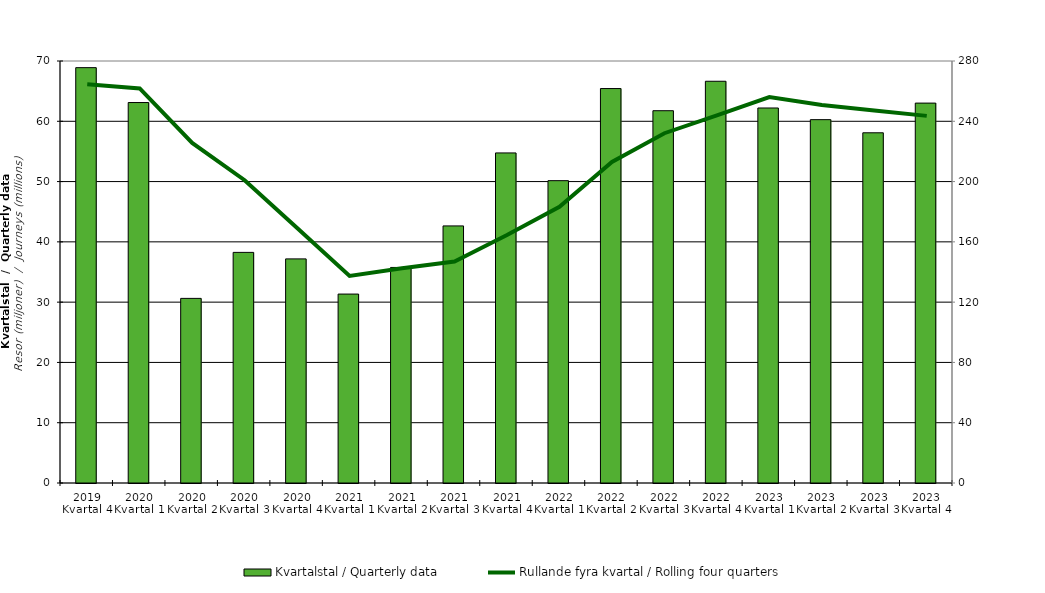
| Category | Kvartalstal / Quarterly data |
|---|---|
| 2019 Kvartal 4 | 68.898 |
| 2020 Kvartal 1 | 63.109 |
| 2020 Kvartal 2 | 30.624 |
| 2020 Kvartal 3 | 38.255 |
| 2020 Kvartal 4 | 37.175 |
| 2021 Kvartal 1 | 31.339 |
| 2021 Kvartal 2 | 35.757 |
| 2021 Kvartal 3 | 42.645 |
| 2021 Kvartal 4 | 54.75 |
| 2022 Kvartal 1 | 50.15 |
| 2022 Kvartal 2 | 65.43 |
| 2022 Kvartal 3 | 61.753 |
| 2022 Kvartal 4 | 66.639 |
| 2023 Kvartal 1 | 62.204 |
| 2023 Kvartal 2 | 60.272 |
| 2023 Kvartal 3 | 58.093 |
| 2023 Kvartal 4 | 63.018 |